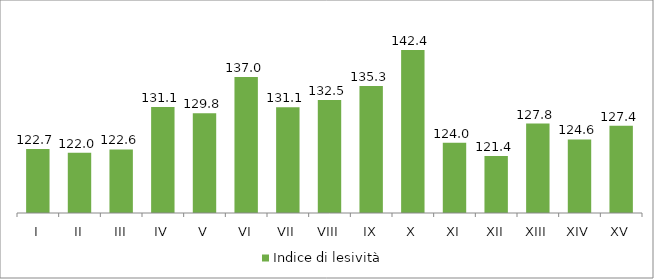
| Category | Indice di lesività  |
|---|---|
| I | 122.727 |
| II | 122.004 |
| III | 122.642 |
| IV | 131.104 |
| V | 129.832 |
| VI | 137.049 |
| VII | 131.055 |
| VIII | 132.496 |
| IX | 135.261 |
| X | 142.447 |
| XI | 123.971 |
| XII | 121.35 |
| XIII | 127.793 |
| XIV | 124.64 |
| XV | 127.352 |